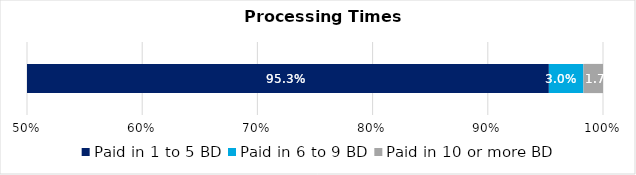
| Category | Paid in 1 to 5 BD | Paid in 6 to 9 BD | Paid in 10 or more BD |
|---|---|---|---|
| 0 | 0.953 | 0.03 | 0.017 |